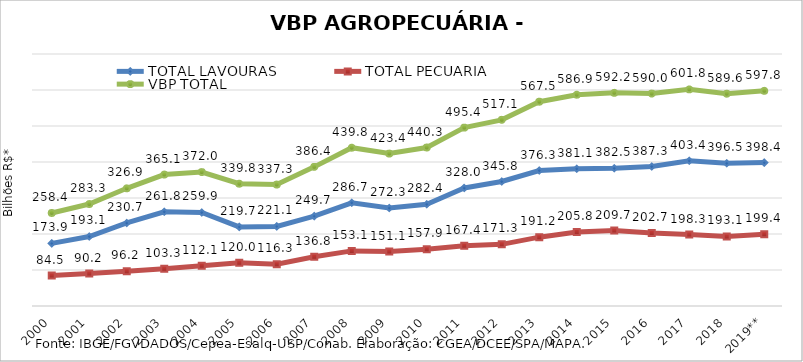
| Category | TOTAL LAVOURAS | TOTAL PECUÁRIA | VBP TOTAL |
|---|---|---|---|
| 2000 | 173.852 | 84.508 | 258.359 |
| 2001 | 193.117 | 90.159 | 283.276 |
| 2002 | 230.685 | 96.245 | 326.93 |
| 2003 | 261.826 | 103.302 | 365.128 |
| 2004 | 259.909 | 112.054 | 371.963 |
| 2005 | 219.741 | 120.037 | 339.778 |
| 2006 | 221.084 | 116.257 | 337.341 |
| 2007 | 249.674 | 136.77 | 386.444 |
| 2008 | 286.687 | 153.078 | 439.765 |
| 2009 | 272.315 | 151.087 | 423.402 |
| 2010 | 282.421 | 157.857 | 440.277 |
| 2011 | 327.997 | 167.446 | 495.442 |
| 2012 | 345.833 | 171.287 | 517.119 |
| 2013 | 376.268 | 191.221 | 567.489 |
| 2014 | 381.109 | 205.808 | 586.917 |
| 2015 | 382.492 | 209.662 | 592.154 |
| 2016 | 387.329 | 202.691 | 590.02 |
| 2017 | 403.422 | 198.336 | 601.757 |
| 2018 | 396.493 | 193.102 | 589.595 |
| 2019** | 398.365 | 199.391 | 597.755 |